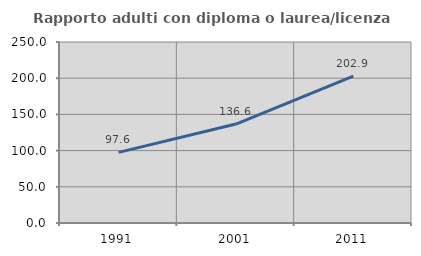
| Category | Rapporto adulti con diploma o laurea/licenza media  |
|---|---|
| 1991.0 | 97.562 |
| 2001.0 | 136.63 |
| 2011.0 | 202.887 |